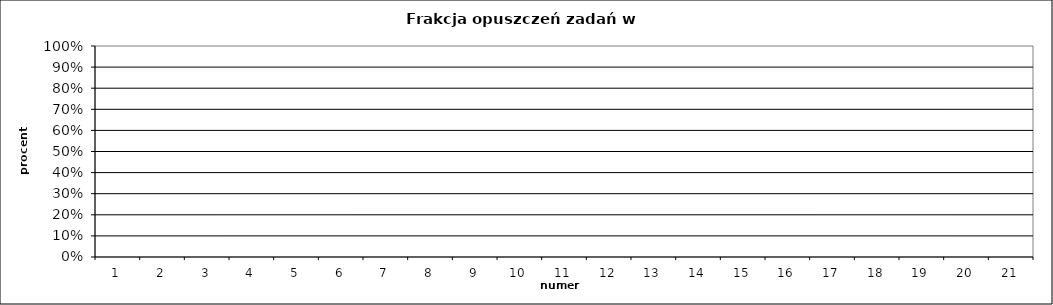
| Category | FO |
|---|---|
| 1.0 | 0 |
| 2.0 | 0 |
| 3.0 | 0 |
| 4.0 | 0 |
| 5.0 | 0 |
| 6.0 | 0 |
| 7.0 | 0 |
| 8.0 | 0 |
| 9.0 | 0 |
| 10.0 | 0 |
| 11.0 | 0 |
| 12.0 | 0 |
| 13.0 | 0 |
| 14.0 | 0 |
| 15.0 | 0 |
| 16.0 | 0 |
| 17.0 | 0 |
| 18.0 | 0 |
| 19.0 | 0 |
| 20.0 | 0 |
| 21.0 | 0 |